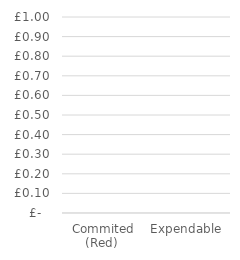
| Category | Series 0 |
|---|---|
| Commited (Red)  | 0 |
| Expendable | 0 |